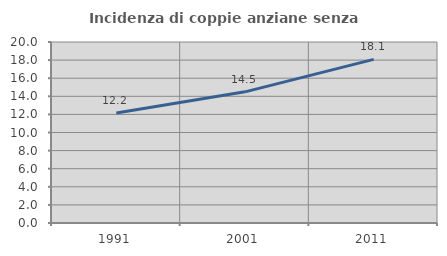
| Category | Incidenza di coppie anziane senza figli  |
|---|---|
| 1991.0 | 12.157 |
| 2001.0 | 14.493 |
| 2011.0 | 18.077 |